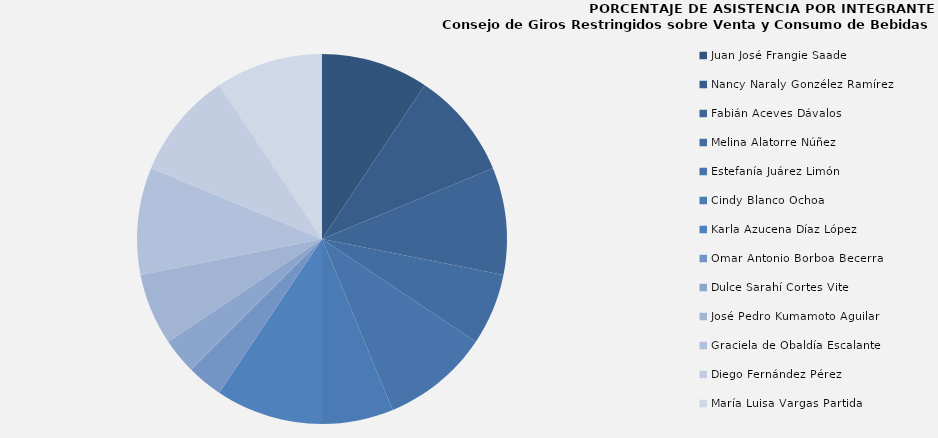
| Category | Series 0 |
|---|---|
| Juan José Frangie Saade | 100 |
| Nancy Naraly Gonzélez Ramírez | 100 |
| Fabián Aceves Dávalos  | 100 |
| Melina Alatorre Núñez  | 66.667 |
| Estefanía Juárez Limón | 100 |
| Cindy Blanco Ochoa | 66.667 |
| Karla Azucena Díaz López | 100 |
| Omar Antonio Borboa Becerra | 33.333 |
| Dulce Sarahí Cortes Vite | 33.333 |
| José Pedro Kumamoto Aguilar | 66.667 |
| Graciela de Obaldía Escalante | 100 |
| Diego Fernández Pérez | 100 |
| María Luisa Vargas Partida | 100 |